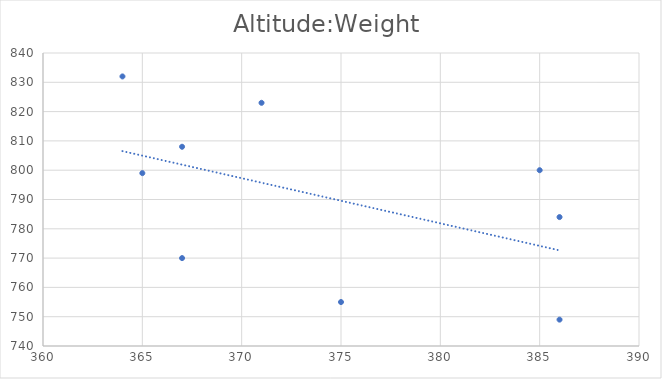
| Category | Green Rocket |
|---|---|
| 371.0 | 823 |
| 385.0 | 800 |
| 386.0 | 749 |
| 386.0 | 784 |
| 375.0 | 755 |
| 367.0 | 808 |
| 367.0 | 770 |
| 365.0 | 799 |
| 364.0 | 832 |